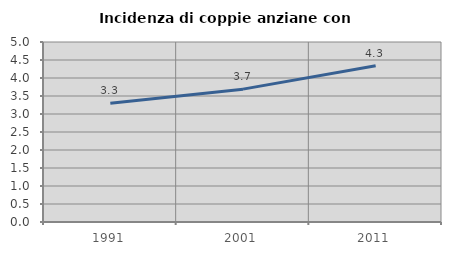
| Category | Incidenza di coppie anziane con figli |
|---|---|
| 1991.0 | 3.3 |
| 2001.0 | 3.69 |
| 2011.0 | 4.341 |